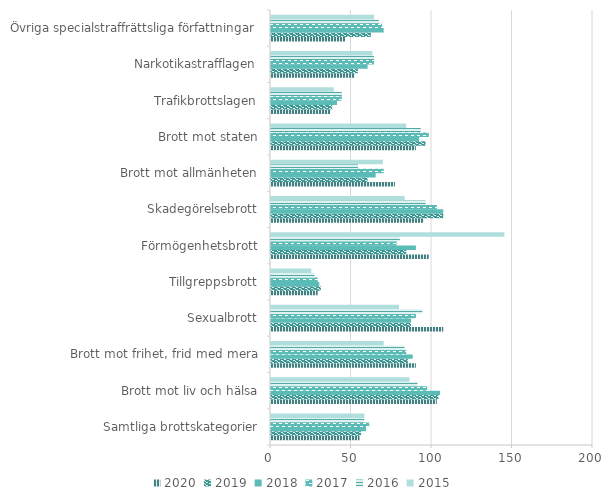
| Category | 2020 | 2019 | 2018 | 2017 | 2016 | 2015 |
|---|---|---|---|---|---|---|
| Samtliga brottskategorier | 55 | 56 | 59 | 61 | 58 | 58 |
| Brott mot liv och hälsa | 103 | 104 | 105 | 97 | 91 | 86 |
| Brott mot frihet, frid med mera | 90 | 85 | 88 | 84 | 83 | 70 |
| Sexualbrott | 107 | 87 | 87 | 90 | 94 | 79.5 |
| Tillgreppsbrott | 29 | 31 | 30 | 29 | 27 | 25 |
| Förmögenhetsbrott | 98 | 84 | 90 | 78 | 80 | 145 |
| Skadegörelsebrott | 95 | 107 | 107 | 103 | 96 | 83 |
| Brott mot allmänheten | 77 | 60 | 65 | 70 | 54 | 69.5 |
| Brott mot staten | 90 | 96 | 92 | 98 | 93 | 84 |
| Trafikbrottslagen | 37 | 38 | 41 | 44 | 44 | 39 |
| Narkotikastrafflagen | 52 | 54 | 60 | 64 | 64 | 63 |
| Övriga specialstraffrättsliga författningar | 46 | 62 | 70 | 69 | 67 | 64 |